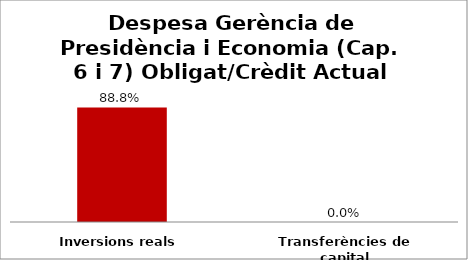
| Category | Series 0 |
|---|---|
| Inversions reals | 0.888 |
| Transferències de capital | 0 |